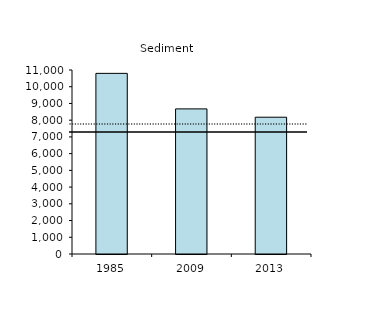
| Category | Series 0 |
|---|---|
| 1985.0 | 10798.384 |
| 2009.0 | 8675.252 |
| 2013.0 | 8177.776 |